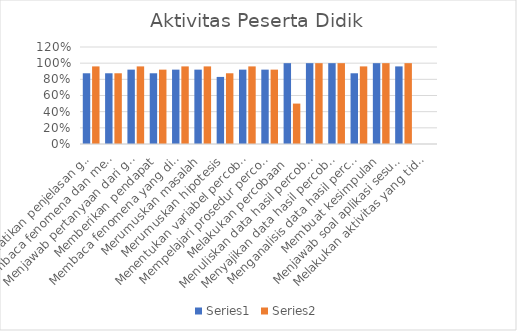
| Category | Series 0 | Series 1 |
|---|---|---|
| Memperhatikan penjelasan guru | 0.875 | 0.96 |
| Membaca fenomena dan menjawab pertanyaan pada LKPD | 0.875 | 0.875 |
| Menjawab pertanyaan dari guru | 0.92 | 0.96 |
| Memberikan pendapat | 0.875 | 0.92 |
| Membaca fenomena yang disajikan di dalam LKPD | 0.92 | 0.96 |
| Merumuskan masalah | 0.92 | 0.96 |
| Merumuskan hipotesis | 0.83 | 0.875 |
| Menentukan variabel percobaan | 0.92 | 0.96 |
| Mempelajari prosedur percobaan | 0.92 | 0.92 |
| Melakukan percobaan  | 1 | 0.5 |
| Menuliskan data hasil percobaan | 1 | 1 |
| Menyajikan data hasil percobaan | 1 | 1 |
| Menganalisis data hasil percobaan | 0.875 | 0.96 |
| Membuat kesimpulan | 1 | 1 |
| Menjawab soal aplikasi sesuai dengan teori | 0.96 | 1 |
| Melakukan aktivitas yang tidak relevan  | 0 | 0 |